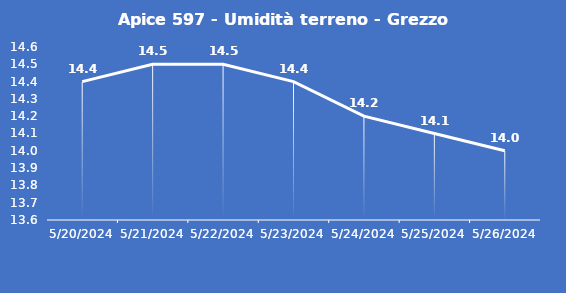
| Category | Apice 597 - Umidità terreno - Grezzo (%VWC) |
|---|---|
| 5/20/24 | 14.4 |
| 5/21/24 | 14.5 |
| 5/22/24 | 14.5 |
| 5/23/24 | 14.4 |
| 5/24/24 | 14.2 |
| 5/25/24 | 14.1 |
| 5/26/24 | 14 |